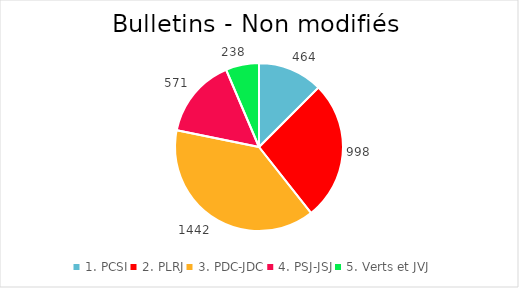
| Category | Series 0 |
|---|---|
| 1. PCSI | 464 |
| 2. PLRJ | 998 |
| 3. PDC-JDC | 1442 |
| 4. PSJ-JSJ | 571 |
| 5. Verts et JVJ | 238 |